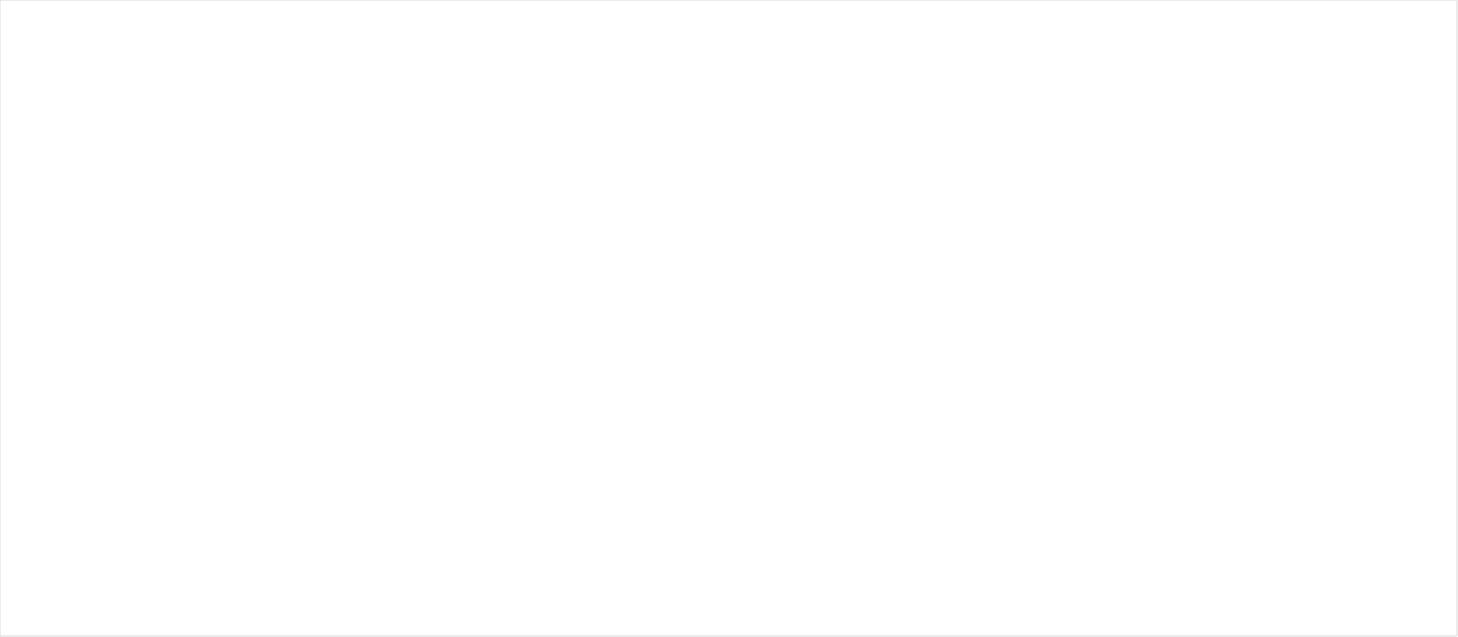
| Category | 1 Strongly Agree | 2 Agree | 3 Disagree | 4 Strongly Disagree | 5 I Don't Know |
|---|---|---|---|---|---|
| I understand what my district's policies regarding assessments mean for my child. | 0.125 | 0.513 | 0.205 | 0.053 | 0.104 |
| I understand what my district's policies regarding attendance mean for my child. | 0.186 | 0.594 | 0.119 | 0.035 | 0.066 |
| I understand what my district's policies regarding grading and report cards mean for my child. | 0.148 | 0.568 | 0.166 | 0.047 | 0.071 |
| I understand what my district's policies regarding promotion and retention mean for my child. | 0.141 | 0.546 | 0.169 | 0.044 | 0.099 |